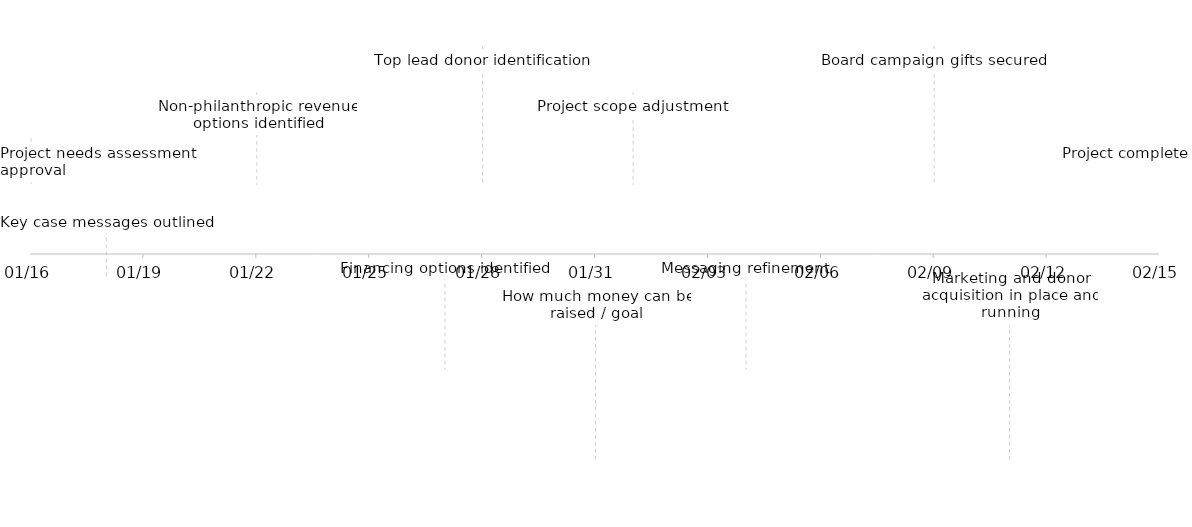
| Category | Series 1 |
|---|---|
| Project needs assessment approval | 5 |
| Key case messages outlined | -5 |
| Non-philanthropic revenue options identified | 10 |
| Financing options identified | -10 |
| Top lead donor identification | 15 |
| How much money can be raised / goal | -15 |
| Project scope adjustment | 10 |
| Messaging refinement | -10 |
| Board campaign gifts secured | 15 |
| Marketing and donor acquisition in place and running | -15 |
| Project complete | 5 |